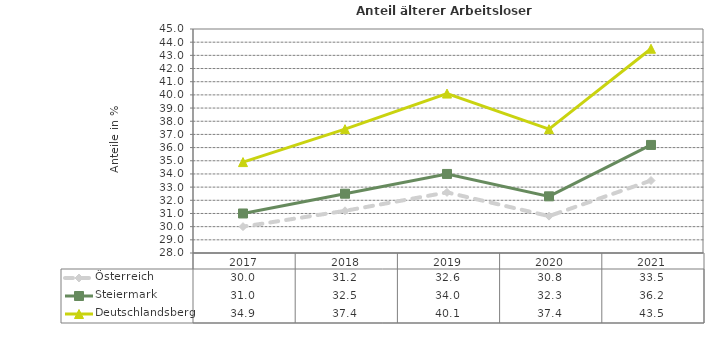
| Category | Österreich | Steiermark | Deutschlandsberg |
|---|---|---|---|
| 2021.0 | 33.5 | 36.2 | 43.5 |
| 2020.0 | 30.8 | 32.3 | 37.4 |
| 2019.0 | 32.6 | 34 | 40.1 |
| 2018.0 | 31.2 | 32.5 | 37.4 |
| 2017.0 | 30 | 31 | 34.9 |